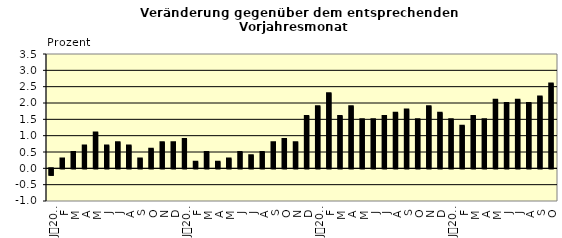
| Category | Series 0 |
|---|---|
| 0 | -0.2 |
| 1 | 0.3 |
| 2 | 0.5 |
| 3 | 0.7 |
| 4 | 1.1 |
| 5 | 0.7 |
| 6 | 0.8 |
| 7 | 0.7 |
| 8 | 0.3 |
| 9 | 0.6 |
| 10 | 0.8 |
| 11 | 0.8 |
| 12 | 0.9 |
| 13 | 0.2 |
| 14 | 0.5 |
| 15 | 0.2 |
| 16 | 0.3 |
| 17 | 0.5 |
| 18 | 0.4 |
| 19 | 0.5 |
| 20 | 0.8 |
| 21 | 0.9 |
| 22 | 0.8 |
| 23 | 1.6 |
| 24 | 1.9 |
| 25 | 2.3 |
| 26 | 1.6 |
| 27 | 1.9 |
| 28 | 1.5 |
| 29 | 1.5 |
| 30 | 1.6 |
| 31 | 1.7 |
| 32 | 1.8 |
| 33 | 1.5 |
| 34 | 1.9 |
| 35 | 1.7 |
| 36 | 1.5 |
| 37 | 1.3 |
| 38 | 1.6 |
| 39 | 1.5 |
| 40 | 2.1 |
| 41 | 2 |
| 42 | 2.1 |
| 43 | 2 |
| 44 | 2.2 |
| 45 | 2.6 |